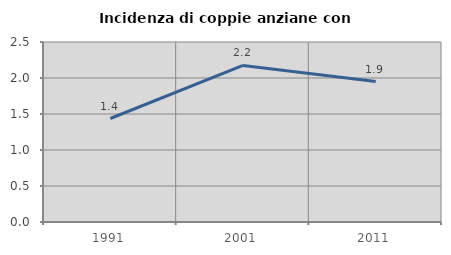
| Category | Incidenza di coppie anziane con figli |
|---|---|
| 1991.0 | 1.437 |
| 2001.0 | 2.174 |
| 2011.0 | 1.95 |